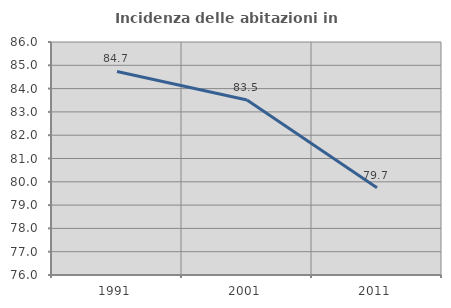
| Category | Incidenza delle abitazioni in proprietà  |
|---|---|
| 1991.0 | 84.735 |
| 2001.0 | 83.508 |
| 2011.0 | 79.741 |